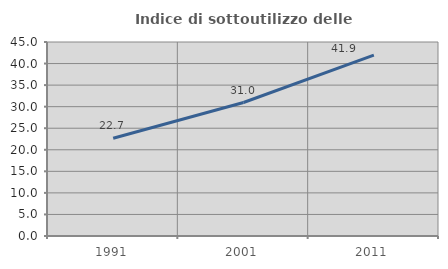
| Category | Indice di sottoutilizzo delle abitazioni  |
|---|---|
| 1991.0 | 22.684 |
| 2001.0 | 30.959 |
| 2011.0 | 41.944 |